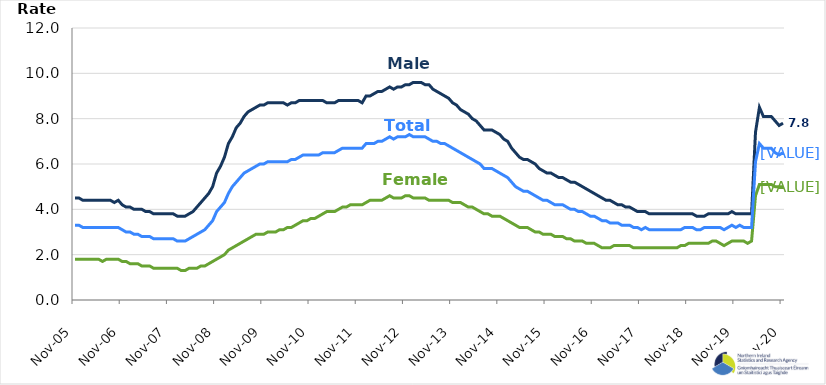
| Category | Male | Female | Total |
|---|---|---|---|
| 2005-11-01 | 4.5 | 1.8 | 3.3 |
| 2005-12-01 | 4.5 | 1.8 | 3.3 |
| 2006-01-01 | 4.4 | 1.8 | 3.2 |
| 2006-02-01 | 4.4 | 1.8 | 3.2 |
| 2006-03-01 | 4.4 | 1.8 | 3.2 |
| 2006-04-01 | 4.4 | 1.8 | 3.2 |
| 2006-05-01 | 4.4 | 1.8 | 3.2 |
| 2006-06-01 | 4.4 | 1.7 | 3.2 |
| 2006-07-01 | 4.4 | 1.8 | 3.2 |
| 2006-08-01 | 4.4 | 1.8 | 3.2 |
| 2006-09-01 | 4.3 | 1.8 | 3.2 |
| 2006-10-01 | 4.4 | 1.8 | 3.2 |
| 2006-11-01 | 4.2 | 1.7 | 3.1 |
| 2006-12-01 | 4.1 | 1.7 | 3 |
| 2007-01-01 | 4.1 | 1.6 | 3 |
| 2007-02-01 | 4 | 1.6 | 2.9 |
| 2007-03-01 | 4 | 1.6 | 2.9 |
| 2007-04-01 | 4 | 1.5 | 2.8 |
| 2007-05-01 | 3.9 | 1.5 | 2.8 |
| 2007-06-01 | 3.9 | 1.5 | 2.8 |
| 2007-07-01 | 3.8 | 1.4 | 2.7 |
| 2007-08-01 | 3.8 | 1.4 | 2.7 |
| 2007-09-01 | 3.8 | 1.4 | 2.7 |
| 2007-10-01 | 3.8 | 1.4 | 2.7 |
| 2007-11-01 | 3.8 | 1.4 | 2.7 |
| 2007-12-01 | 3.8 | 1.4 | 2.7 |
| 2008-01-01 | 3.7 | 1.4 | 2.6 |
| 2008-02-01 | 3.7 | 1.3 | 2.6 |
| 2008-03-01 | 3.7 | 1.3 | 2.6 |
| 2008-04-01 | 3.8 | 1.4 | 2.7 |
| 2008-05-01 | 3.9 | 1.4 | 2.8 |
| 2008-06-01 | 4.1 | 1.4 | 2.9 |
| 2008-07-01 | 4.3 | 1.5 | 3 |
| 2008-08-01 | 4.5 | 1.5 | 3.1 |
| 2008-09-01 | 4.7 | 1.6 | 3.3 |
| 2008-10-01 | 5 | 1.7 | 3.5 |
| 2008-11-01 | 5.6 | 1.8 | 3.9 |
| 2008-12-01 | 5.9 | 1.9 | 4.1 |
| 2009-01-01 | 6.3 | 2 | 4.3 |
| 2009-02-01 | 6.9 | 2.2 | 4.7 |
| 2009-03-01 | 7.2 | 2.3 | 5 |
| 2009-04-01 | 7.6 | 2.4 | 5.2 |
| 2009-05-01 | 7.8 | 2.5 | 5.4 |
| 2009-06-01 | 8.1 | 2.6 | 5.6 |
| 2009-07-01 | 8.3 | 2.7 | 5.7 |
| 2009-08-01 | 8.4 | 2.8 | 5.8 |
| 2009-09-01 | 8.5 | 2.9 | 5.9 |
| 2009-10-01 | 8.6 | 2.9 | 6 |
| 2009-11-01 | 8.6 | 2.9 | 6 |
| 2009-12-01 | 8.7 | 3 | 6.1 |
| 2010-01-01 | 8.7 | 3 | 6.1 |
| 2010-02-01 | 8.7 | 3 | 6.1 |
| 2010-03-01 | 8.7 | 3.1 | 6.1 |
| 2010-04-01 | 8.7 | 3.1 | 6.1 |
| 2010-05-01 | 8.6 | 3.2 | 6.1 |
| 2010-06-01 | 8.7 | 3.2 | 6.2 |
| 2010-07-01 | 8.7 | 3.3 | 6.2 |
| 2010-08-01 | 8.8 | 3.4 | 6.3 |
| 2010-09-01 | 8.8 | 3.5 | 6.4 |
| 2010-10-01 | 8.8 | 3.5 | 6.4 |
| 2010-11-01 | 8.8 | 3.6 | 6.4 |
| 2010-12-01 | 8.8 | 3.6 | 6.4 |
| 2011-01-01 | 8.8 | 3.7 | 6.4 |
| 2011-02-01 | 8.8 | 3.8 | 6.5 |
| 2011-03-01 | 8.7 | 3.9 | 6.5 |
| 2011-04-01 | 8.7 | 3.9 | 6.5 |
| 2011-05-01 | 8.7 | 3.9 | 6.5 |
| 2011-06-01 | 8.8 | 4 | 6.6 |
| 2011-07-01 | 8.8 | 4.1 | 6.7 |
| 2011-08-01 | 8.8 | 4.1 | 6.7 |
| 2011-09-01 | 8.8 | 4.2 | 6.7 |
| 2011-10-01 | 8.8 | 4.2 | 6.7 |
| 2011-11-01 | 8.8 | 4.2 | 6.7 |
| 2011-12-01 | 8.7 | 4.2 | 6.7 |
| 2012-01-01 | 9 | 4.3 | 6.9 |
| 2012-02-01 | 9 | 4.4 | 6.9 |
| 2012-03-01 | 9.1 | 4.4 | 6.9 |
| 2012-04-01 | 9.2 | 4.4 | 7 |
| 2012-05-01 | 9.2 | 4.4 | 7 |
| 2012-06-01 | 9.3 | 4.5 | 7.1 |
| 2012-07-01 | 9.4 | 4.6 | 7.2 |
| 2012-08-01 | 9.3 | 4.5 | 7.1 |
| 2012-09-01 | 9.4 | 4.5 | 7.2 |
| 2012-10-01 | 9.4 | 4.5 | 7.2 |
| 2012-11-01 | 9.5 | 4.6 | 7.2 |
| 2012-12-01 | 9.5 | 4.6 | 7.3 |
| 2013-01-01 | 9.6 | 4.5 | 7.2 |
| 2013-02-01 | 9.6 | 4.5 | 7.2 |
| 2013-03-01 | 9.6 | 4.5 | 7.2 |
| 2013-04-01 | 9.5 | 4.5 | 7.2 |
| 2013-05-01 | 9.5 | 4.4 | 7.1 |
| 2013-06-01 | 9.3 | 4.4 | 7 |
| 2013-07-01 | 9.2 | 4.4 | 7 |
| 2013-08-01 | 9.1 | 4.4 | 6.9 |
| 2013-09-01 | 9 | 4.4 | 6.9 |
| 2013-10-01 | 8.9 | 4.4 | 6.8 |
| 2013-11-01 | 8.7 | 4.3 | 6.7 |
| 2013-12-01 | 8.6 | 4.3 | 6.6 |
| 2014-01-01 | 8.4 | 4.3 | 6.5 |
| 2014-02-01 | 8.3 | 4.2 | 6.4 |
| 2014-03-01 | 8.2 | 4.1 | 6.3 |
| 2014-04-01 | 8 | 4.1 | 6.2 |
| 2014-05-01 | 7.9 | 4 | 6.1 |
| 2014-06-01 | 7.7 | 3.9 | 6 |
| 2014-07-01 | 7.5 | 3.8 | 5.8 |
| 2014-08-01 | 7.5 | 3.8 | 5.8 |
| 2014-09-01 | 7.5 | 3.7 | 5.8 |
| 2014-10-01 | 7.4 | 3.7 | 5.7 |
| 2014-11-01 | 7.3 | 3.7 | 5.6 |
| 2014-12-01 | 7.1 | 3.6 | 5.5 |
| 2015-01-01 | 7 | 3.5 | 5.4 |
| 2015-02-01 | 6.7 | 3.4 | 5.2 |
| 2015-03-01 | 6.5 | 3.3 | 5 |
| 2015-04-01 | 6.3 | 3.2 | 4.9 |
| 2015-05-01 | 6.2 | 3.2 | 4.8 |
| 2015-06-01 | 6.2 | 3.2 | 4.8 |
| 2015-07-01 | 6.1 | 3.1 | 4.7 |
| 2015-08-01 | 6 | 3 | 4.6 |
| 2015-09-01 | 5.8 | 3 | 4.5 |
| 2015-10-01 | 5.7 | 2.9 | 4.4 |
| 2015-11-01 | 5.6 | 2.9 | 4.4 |
| 2015-12-01 | 5.6 | 2.9 | 4.3 |
| 2016-01-01 | 5.5 | 2.8 | 4.2 |
| 2016-02-01 | 5.4 | 2.8 | 4.2 |
| 2016-03-01 | 5.4 | 2.8 | 4.2 |
| 2016-04-01 | 5.3 | 2.7 | 4.1 |
| 2016-05-01 | 5.2 | 2.7 | 4 |
| 2016-06-01 | 5.2 | 2.6 | 4 |
| 2016-07-01 | 5.1 | 2.6 | 3.9 |
| 2016-08-01 | 5 | 2.6 | 3.9 |
| 2016-09-01 | 4.9 | 2.5 | 3.8 |
| 2016-10-01 | 4.8 | 2.5 | 3.7 |
| 2016-11-01 | 4.7 | 2.5 | 3.7 |
| 2016-12-01 | 4.6 | 2.4 | 3.6 |
| 2017-01-01 | 4.5 | 2.3 | 3.5 |
| 2017-02-01 | 4.4 | 2.3 | 3.5 |
| 2017-03-01 | 4.4 | 2.3 | 3.4 |
| 2017-04-01 | 4.3 | 2.4 | 3.4 |
| 2017-05-01 | 4.2 | 2.4 | 3.4 |
| 2017-06-01 | 4.2 | 2.4 | 3.3 |
| 2017-07-01 | 4.1 | 2.4 | 3.3 |
| 2017-08-01 | 4.1 | 2.4 | 3.3 |
| 2017-09-01 | 4 | 2.3 | 3.2 |
| 2017-10-01 | 3.9 | 2.3 | 3.2 |
| 2017-11-01 | 3.9 | 2.3 | 3.1 |
| 2017-12-01 | 3.9 | 2.3 | 3.2 |
| 2018-01-01 | 3.8 | 2.3 | 3.1 |
| 2018-02-01 | 3.8 | 2.3 | 3.1 |
| 2018-03-01 | 3.8 | 2.3 | 3.1 |
| 2018-04-01 | 3.8 | 2.3 | 3.1 |
| 2018-05-01 | 3.8 | 2.3 | 3.1 |
| 2018-06-01 | 3.8 | 2.3 | 3.1 |
| 2018-07-01 | 3.8 | 2.3 | 3.1 |
| 2018-08-01 | 3.8 | 2.3 | 3.1 |
| 2018-09-01 | 3.8 | 2.4 | 3.1 |
| 2018-10-01 | 3.8 | 2.4 | 3.2 |
| 2018-11-01 | 3.8 | 2.5 | 3.2 |
| 2018-12-01 | 3.8 | 2.5 | 3.2 |
| 2019-01-01 | 3.7 | 2.5 | 3.1 |
| 2019-02-01 | 3.7 | 2.5 | 3.1 |
| 2019-03-01 | 3.7 | 2.5 | 3.2 |
| 2019-04-01 | 3.8 | 2.5 | 3.2 |
| 2019-05-01 | 3.8 | 2.6 | 3.2 |
| 2019-06-01 | 3.8 | 2.6 | 3.2 |
| 2019-07-01 | 3.8 | 2.5 | 3.2 |
| 2019-08-01 | 3.8 | 2.4 | 3.1 |
| 2019-09-01 | 3.8 | 2.5 | 3.2 |
| 2019-10-01 | 3.9 | 2.6 | 3.3 |
| 2019-11-01 | 3.8 | 2.6 | 3.2 |
| 2019-12-01 | 3.8 | 2.6 | 3.3 |
| 2020-01-01 | 3.8 | 2.6 | 3.2 |
| 2020-02-01 | 3.8 | 2.5 | 3.2 |
| 2020-03-01 | 3.8 | 2.6 | 3.2 |
| 2020-04-01 | 7.4 | 4.6 | 6.1 |
| 2020-05-01 | 8.5 | 5.1 | 6.9 |
| 2020-06-01 | 8.1 | 5.1 | 6.7 |
| 2020-07-01 | 8.1 | 5.1 | 6.7 |
| 2020-08-01 | 8.1 | 5.1 | 6.7 |
| 2020-09-01 | 7.9 | 5 | 6.5 |
| 2020-10-01 | 7.7 | 5 | 6.4 |
| 2020-11-01 | 7.8 | 5 | 6.5 |